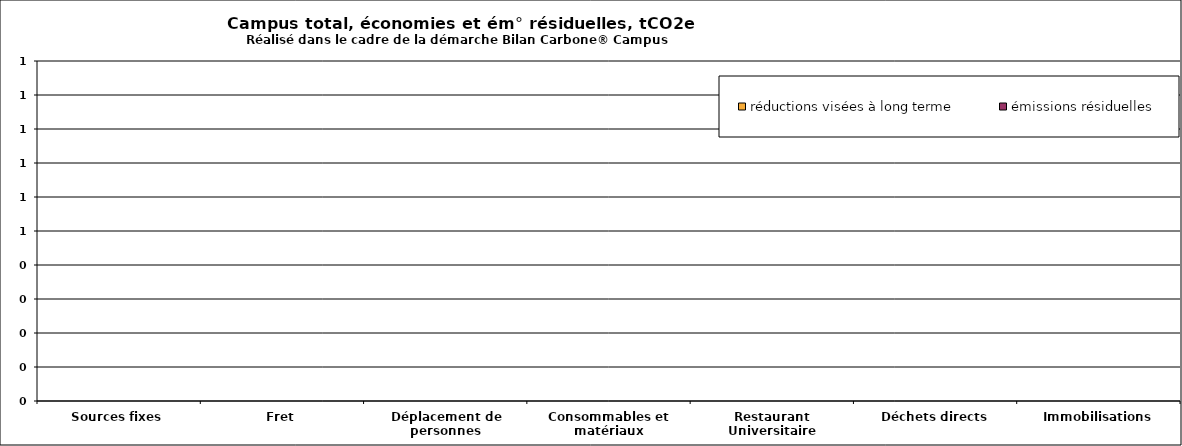
| Category | émissions résiduelles | réductions visées à long terme |
|---|---|---|
| Sources fixes | 0 | 0 |
| Fret | 0 | 0 |
| Déplacement de personnes | 0 | 0 |
| Consommables et matériaux | 0 | 0 |
| Restaurant Universitaire | 0 | 0 |
| Déchets directs | 0 | 0 |
| Immobilisations | 0 | 0 |